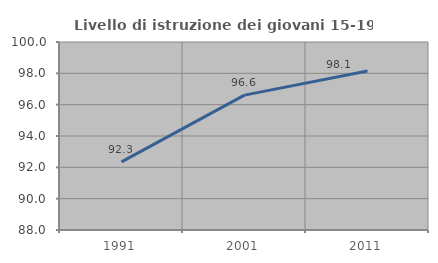
| Category | Livello di istruzione dei giovani 15-19 anni |
|---|---|
| 1991.0 | 92.344 |
| 2001.0 | 96.61 |
| 2011.0 | 98.148 |